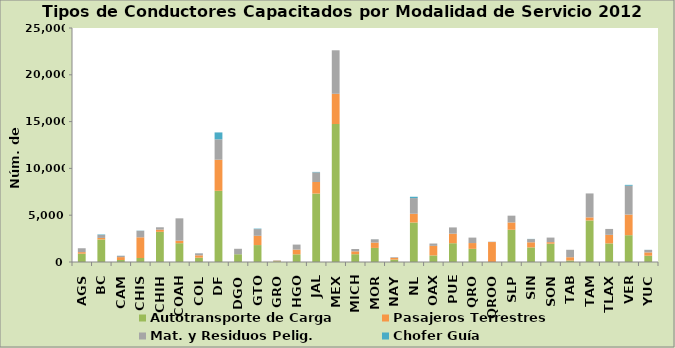
| Category | Autotransporte de Carga | Pasajeros Terrestres | Mat. y Residuos Pelig. | Chofer Guía |
|---|---|---|---|---|
| AGS | 890 | 165 | 414 | 0 |
| BC | 2407 | 165 | 321 | 49 |
| CAM | 212 | 310 | 141 | 10 |
| CHIS | 426 | 2213 | 696 | 20 |
| CHIH | 3226 | 235 | 248 | 0 |
| COAH | 2011 | 269 | 2385 | 0 |
| COL | 465 | 246 | 216 | 6 |
| DF | 7605 | 3323 | 2178 | 737 |
| DGO | 830 | 0 | 583 | 0 |
| GTO | 1809 | 991 | 717 | 49 |
| GRO | 81 | 54 | 45 | 0 |
| HGO | 822 | 503 | 536 | 0 |
| JAL | 7311 | 1236 | 1033 | 45 |
| MEX | 14741 | 3230 | 4649 | 0 |
| MICH | 833 | 306 | 251 | 0 |
| MOR | 1505 | 569 | 353 | 5 |
| NAY | 259 | 182 | 71 | 0 |
| NL | 4220 | 934 | 1675 | 142 |
| OAX | 703 | 1021 | 251 | 0 |
| PUE | 2007 | 1019 | 669 | 0 |
| QRO | 1406 | 619 | 582 | 0 |
| QROO | 0 | 2132 | 35 | 0 |
| SLP | 3446 | 778 | 726 | 0 |
| SIN | 1560 | 546 | 344 | 17 |
| SON | 1956 | 165 | 489 | 0 |
| TAB | 161 | 349 | 795 | 0 |
| TAM | 4441 | 327 | 2557 | 0 |
| TLAX | 1990 | 913 | 629 | 0 |
| VER | 2864 | 2203 | 3080 | 95 |
| YUC | 671 | 356 | 267 | 9 |